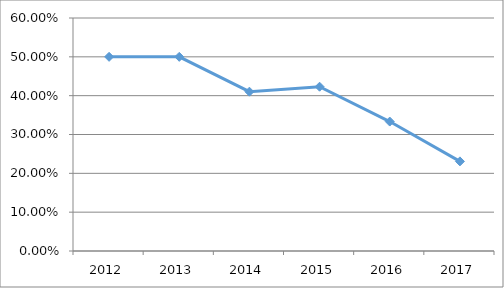
| Category | ESIN-I3O23 |
|---|---|
| 2012.0 | 0.5 |
| 2013.0 | 0.5 |
| 2014.0 | 0.41 |
| 2015.0 | 0.423 |
| 2016.0 | 0.333 |
| 2017.0 | 0.231 |